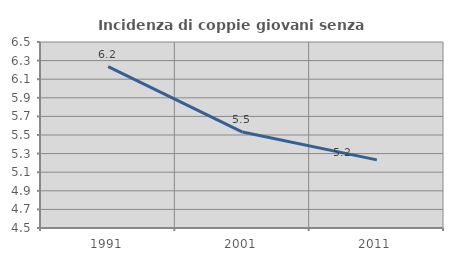
| Category | Incidenza di coppie giovani senza figli |
|---|---|
| 1991.0 | 6.235 |
| 2001.0 | 5.532 |
| 2011.0 | 5.233 |